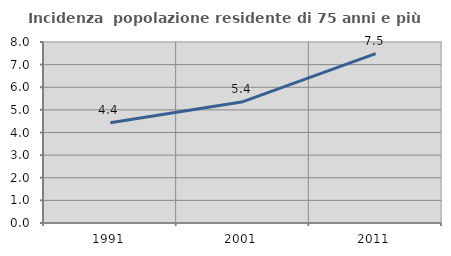
| Category | Incidenza  popolazione residente di 75 anni e più |
|---|---|
| 1991.0 | 4.427 |
| 2001.0 | 5.362 |
| 2011.0 | 7.49 |